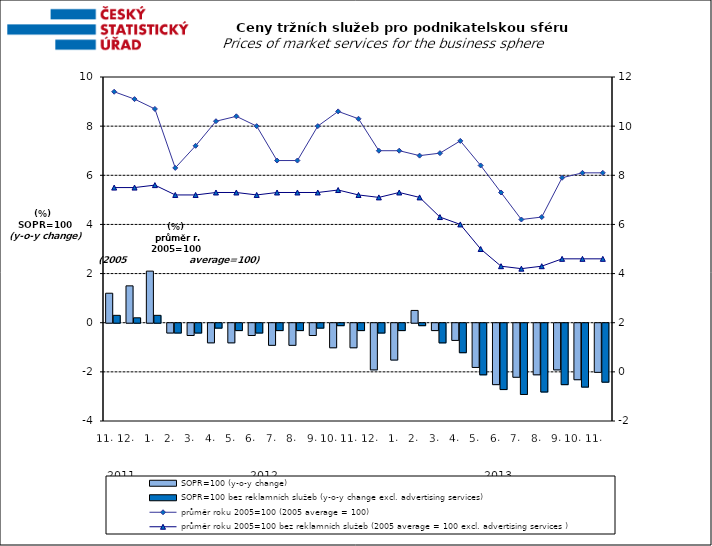
| Category | SOPR=100 (y-o-y change)   | SOPR=100 bez reklamních služeb (y-o-y change excl. advertising services)   |
|---|---|---|
| 0 | 1.2 | 0.3 |
| 1 | 1.5 | 0.2 |
| 2 | 2.1 | 0.3 |
| 3 | -0.4 | -0.4 |
| 4 | -0.5 | -0.4 |
| 5 | -0.8 | -0.2 |
| 6 | -0.8 | -0.3 |
| 7 | -0.5 | -0.4 |
| 8 | -0.9 | -0.3 |
| 9 | -0.9 | -0.3 |
| 10 | -0.5 | -0.2 |
| 11 | -1 | -0.1 |
| 12 | -1 | -0.3 |
| 13 | -1.9 | -0.4 |
| 14 | -1.5 | -0.3 |
| 15 | 0.5 | -0.1 |
| 16 | -0.3 | -0.8 |
| 17 | -0.7 | -1.2 |
| 18 | -1.8 | -2.1 |
| 19 | -2.5 | -2.7 |
| 20 | -2.2 | -2.9 |
| 21 | -2.1 | -2.8 |
| 22 | -1.9 | -2.5 |
| 23 | -2.3 | -2.6 |
| 24 | -2 | -2.4 |